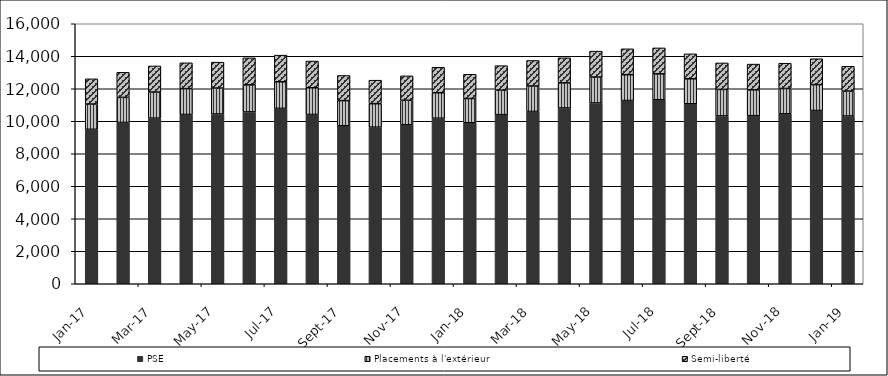
| Category | PSE | Placements à l'extérieur | Semi-liberté |
|---|---|---|---|
| 2017-01-01 | 9505 | 1553 | 1553 |
| 2017-02-01 | 9927 | 1542 | 1542 |
| 2017-03-01 | 10190 | 1607 | 1607 |
| 2017-04-01 | 10417 | 1590 | 1590 |
| 2017-05-01 | 10448 | 1594 | 1594 |
| 2017-06-01 | 10575 | 1664 | 1664 |
| 2017-07-01 | 10791 | 1639 | 1639 |
| 2017-08-01 | 10417 | 1644 | 1644 |
| 2017-09-01 | 9723 | 1547 | 1547 |
| 2017-10-01 | 9637 | 1445 | 1445 |
| 2017-11-01 | 9787 | 1504 | 1504 |
| 2017-12-01 | 10187 | 1568 | 1568 |
| 2018-01-01 | 9907 | 1493 | 1493 |
| 2018-02-01 | 10406 | 1508 | 1508 |
| 2018-03-01 | 10603 | 1569 | 1569 |
| 2018-04-01 | 10817 | 1544 | 1544 |
| 2018-05-01 | 11127 | 1594 | 1594 |
| 2018-06-01 | 11275 | 1591 | 1591 |
| 2018-07-01 | 11322 | 1596 | 1596 |
| 2018-08-01 | 11075 | 1537 | 1537 |
| 2018-09-01 | 10329 | 1630 | 1630 |
| 2018-10-01 | 10344 | 1587 | 1587 |
| 2018-11-01 | 10458 | 1557 | 1557 |
| 2018-12-01 | 10661 | 1593 | 1593 |
| 2019-01-01 | 10325 | 1530 | 1530 |